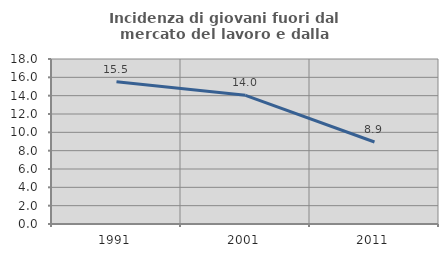
| Category | Incidenza di giovani fuori dal mercato del lavoro e dalla formazione  |
|---|---|
| 1991.0 | 15.517 |
| 2001.0 | 14.035 |
| 2011.0 | 8.943 |